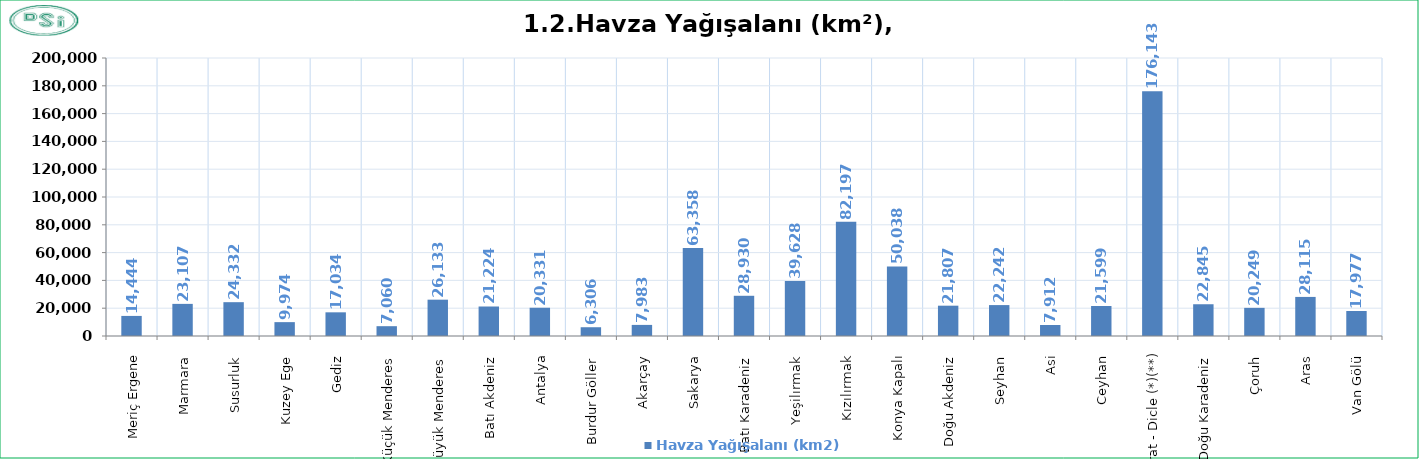
| Category | Havza Yağışalanı (km2) |
|---|---|
| Meriç Ergene | 14444.1 |
| Marmara  | 23107.2 |
| Susurluk  | 24332 |
| Kuzey Ege  | 9973.6 |
| Gediz  | 17034 |
| Küçük Menderes  | 7059.7 |
| Büyük Menderes  | 26133.2 |
| Batı Akdeniz  | 21223.9 |
| Antalya  | 20330.8 |
| Burdur Göller  | 6306.2 |
| Akarçay  | 7982.6 |
| Sakarya  | 63357.8 |
| Batı Karadeniz  | 28929.8 |
| Yeşilırmak  | 39628 |
| Kızılırmak  | 82197.3 |
| Konya Kapalı  | 50037.8 |
| Doğu Akdeniz  | 21807 |
| Seyhan  | 22241.6 |
| Asi  | 7912.4 |
| Ceyhan  | 21598.5 |
| Fırat - Dicle (*)(**) | 176142.7 |
| Doğu Karadeniz  | 22844.6 |
| Çoruh  | 20248.7 |
| Aras  | 28114.6 |
| Van Gölü  | 17977 |